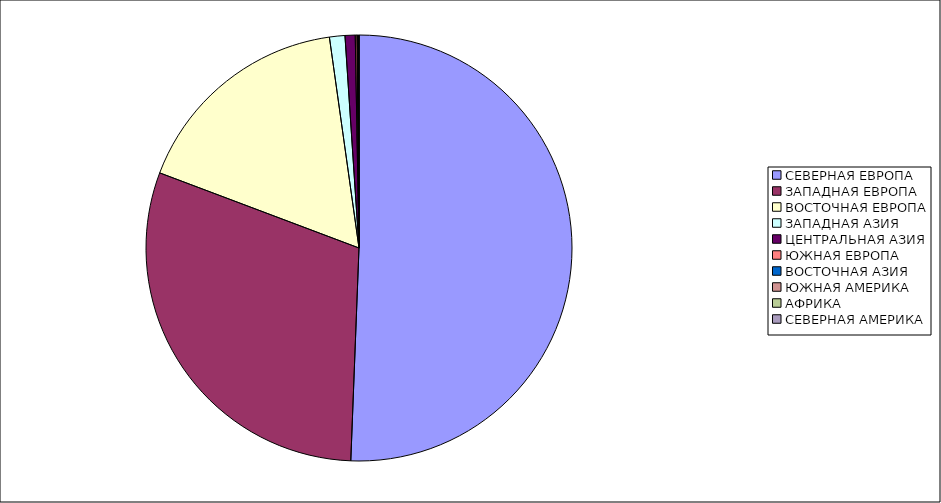
| Category | Оборот |
|---|---|
| СЕВЕРНАЯ ЕВРОПА | 50.614 |
| ЗАПАДНАЯ ЕВРОПА | 30.123 |
| ВОСТОЧНАЯ ЕВРОПА | 17.043 |
| ЗАПАДНАЯ АЗИЯ | 1.17 |
| ЦЕНТРАЛЬНАЯ АЗИЯ | 0.77 |
| ЮЖНАЯ ЕВРОПА | 0.13 |
| ВОСТОЧНАЯ АЗИЯ | 0.058 |
| ЮЖНАЯ АМЕРИКА | 0.052 |
| АФРИКА | 0.041 |
| СЕВЕРНАЯ АМЕРИКА | 0 |